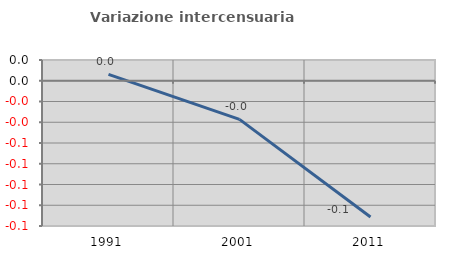
| Category | Variazione intercensuaria annua |
|---|---|
| 1991.0 | 0.006 |
| 2001.0 | -0.037 |
| 2011.0 | -0.131 |